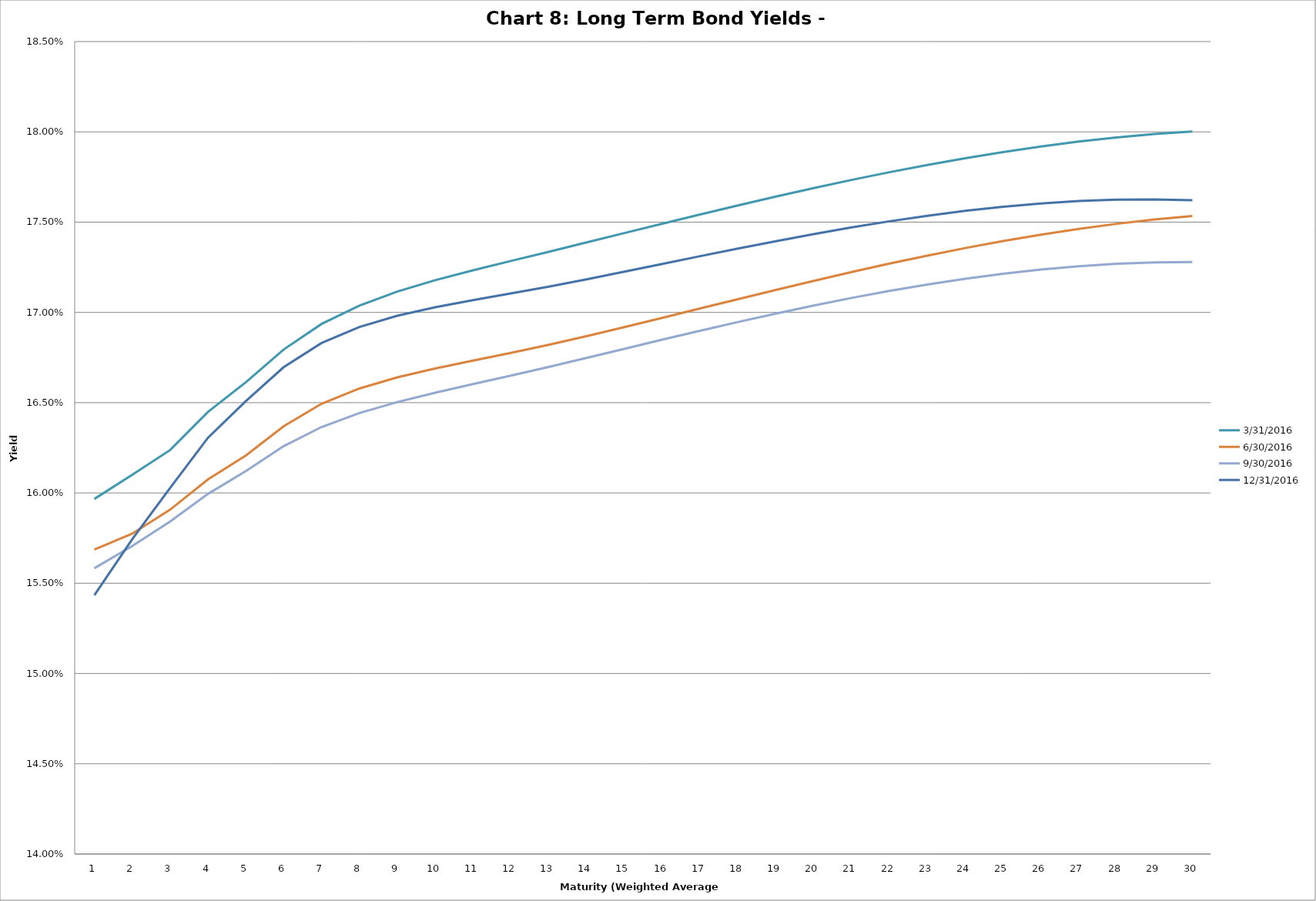
| Category | 3/31/2016 | 6/30/2016 | 9/30/2016 | 12/31/2016 |
|---|---|---|---|---|
| 0 | 0.16 | 0.157 | 0.156 | 0.154 |
| 1 | 0.161 | 0.158 | 0.157 | 0.157 |
| 2 | 0.162 | 0.159 | 0.158 | 0.16 |
| 3 | 0.164 | 0.161 | 0.16 | 0.163 |
| 4 | 0.166 | 0.162 | 0.161 | 0.165 |
| 5 | 0.168 | 0.164 | 0.163 | 0.167 |
| 6 | 0.169 | 0.165 | 0.164 | 0.168 |
| 7 | 0.17 | 0.166 | 0.164 | 0.169 |
| 8 | 0.171 | 0.166 | 0.165 | 0.17 |
| 9 | 0.172 | 0.167 | 0.166 | 0.17 |
| 10 | 0.172 | 0.167 | 0.166 | 0.171 |
| 11 | 0.173 | 0.168 | 0.166 | 0.171 |
| 12 | 0.173 | 0.168 | 0.167 | 0.171 |
| 13 | 0.174 | 0.169 | 0.167 | 0.172 |
| 14 | 0.174 | 0.169 | 0.168 | 0.172 |
| 15 | 0.175 | 0.17 | 0.168 | 0.173 |
| 16 | 0.175 | 0.17 | 0.169 | 0.173 |
| 17 | 0.176 | 0.171 | 0.169 | 0.174 |
| 18 | 0.176 | 0.171 | 0.17 | 0.174 |
| 19 | 0.177 | 0.172 | 0.17 | 0.174 |
| 20 | 0.177 | 0.172 | 0.171 | 0.175 |
| 21 | 0.178 | 0.173 | 0.171 | 0.175 |
| 22 | 0.178 | 0.173 | 0.172 | 0.175 |
| 23 | 0.179 | 0.174 | 0.172 | 0.176 |
| 24 | 0.179 | 0.174 | 0.172 | 0.176 |
| 25 | 0.179 | 0.174 | 0.172 | 0.176 |
| 26 | 0.179 | 0.175 | 0.173 | 0.176 |
| 27 | 0.18 | 0.175 | 0.173 | 0.176 |
| 28 | 0.18 | 0.175 | 0.173 | 0.176 |
| 29 | 0.18 | 0.175 | 0.173 | 0.176 |